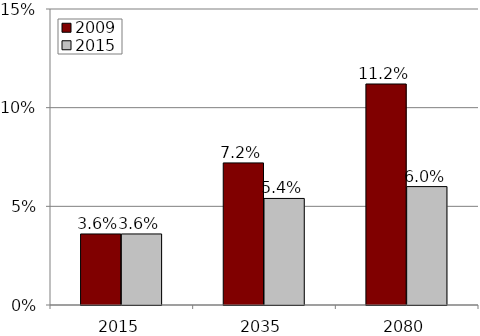
| Category | 2009 | 2015 |
|---|---|---|
| 2015.0 | 3.6 | 3.6 |
| 2035.0 | 7.2 | 5.4 |
| 2080.0 | 11.2 | 6 |